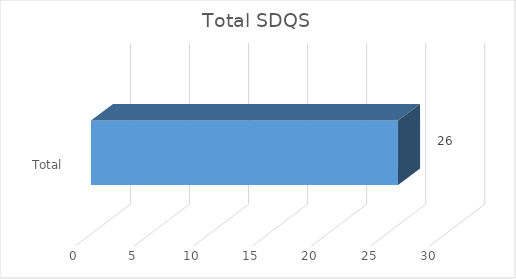
| Category | Total |
|---|---|
| Total | 26 |